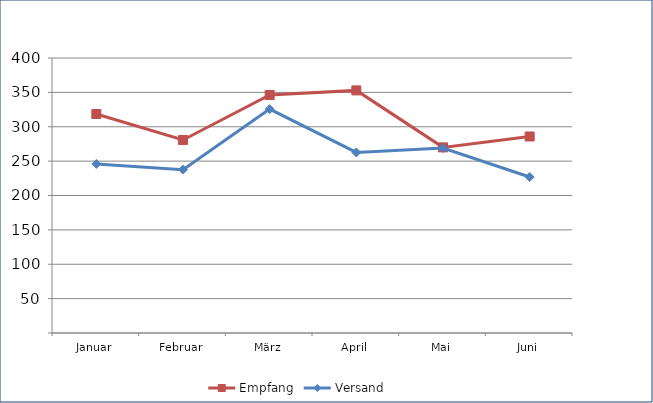
| Category | Empfang | Versand |
|---|---|---|
| Januar | 318.526 | 245.926 |
| Februar | 280.759 | 237.641 |
| März | 346.199 | 325.661 |
| April | 352.884 | 262.658 |
| Mai | 270.011 | 269.084 |
| Juni | 285.852 | 226.84 |